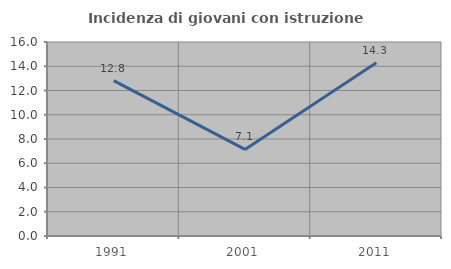
| Category | Incidenza di giovani con istruzione universitaria |
|---|---|
| 1991.0 | 12.821 |
| 2001.0 | 7.143 |
| 2011.0 | 14.286 |